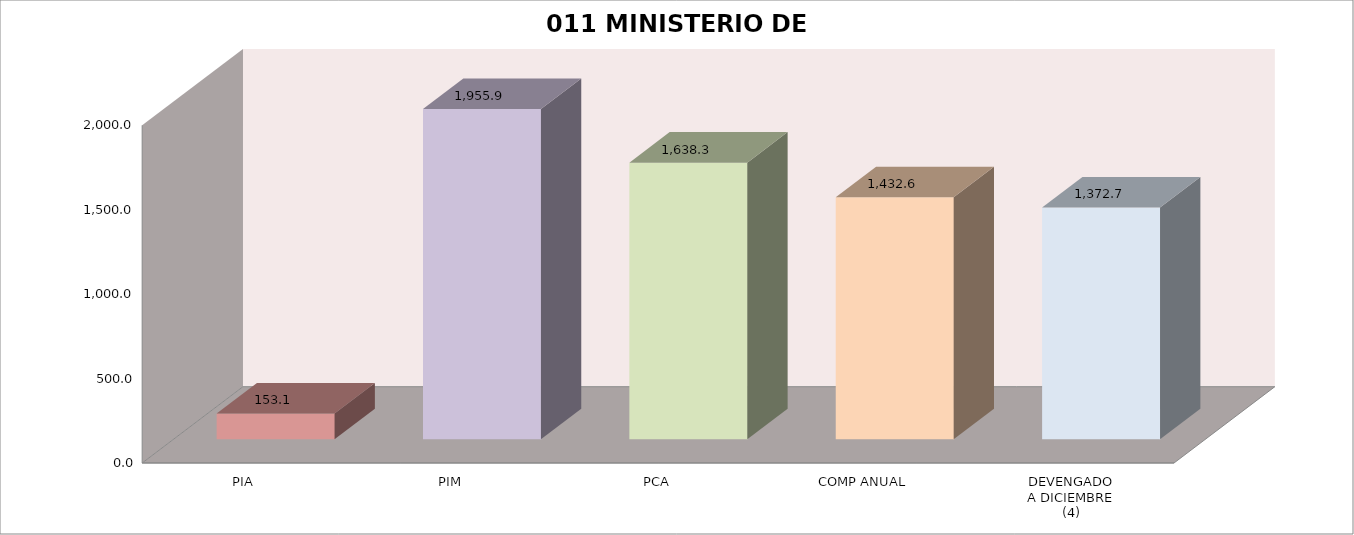
| Category | 011 MINISTERIO DE SALUD |
|---|---|
| PIA | 153.071 |
| PIM | 1955.922 |
| PCA | 1638.298 |
| COMP ANUAL | 1432.595 |
| DEVENGADO
A DICIEMBRE
(4) | 1372.745 |